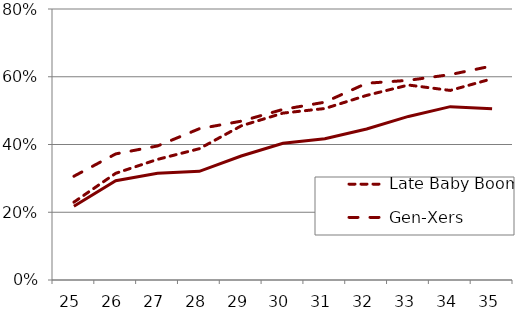
| Category | Late Baby Boomers | Gen-Xers | Millennials |
|---|---|---|---|
| 25.0 | 0.23 | 0.306 | 0.218 |
| 26.0 | 0.315 | 0.372 | 0.293 |
| 27.0 | 0.356 | 0.396 | 0.315 |
| 28.0 | 0.388 | 0.447 | 0.321 |
| 29.0 | 0.455 | 0.469 | 0.366 |
| 30.0 | 0.493 | 0.504 | 0.404 |
| 31.0 | 0.506 | 0.525 | 0.417 |
| 32.0 | 0.545 | 0.581 | 0.446 |
| 33.0 | 0.576 | 0.589 | 0.483 |
| 34.0 | 0.56 | 0.606 | 0.512 |
| 35.0 | 0.594 | 0.632 | 0.506 |